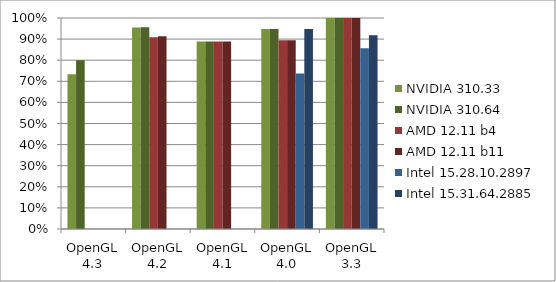
| Category | NVIDIA 310.33 | NVIDIA 310.64 | AMD 12.11 b4 | AMD 12.11 b11 | Intel 15.28.10.2897 | Intel 15.31.64.2885 |
|---|---|---|---|---|---|---|
| OpenGL 4.3 | 0.733 | 0.8 | 0 | 0 | 0 | 0 |
| OpenGL 4.2 | 0.955 | 0.957 | 0.909 | 0.913 | 0 | 0 |
| OpenGL 4.1 | 0.889 | 0.889 | 0.889 | 0.889 | 0 | 0 |
| OpenGL 4.0 | 0.947 | 0.947 | 0.895 | 0.895 | 0.737 | 0.947 |
| OpenGL 3.3 | 1 | 1 | 1 | 1 | 0.857 | 0.918 |